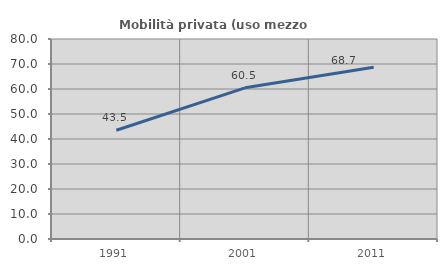
| Category | Mobilità privata (uso mezzo privato) |
|---|---|
| 1991.0 | 43.49 |
| 2001.0 | 60.473 |
| 2011.0 | 68.705 |